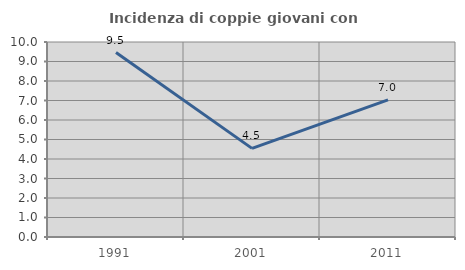
| Category | Incidenza di coppie giovani con figli |
|---|---|
| 1991.0 | 9.459 |
| 2001.0 | 4.545 |
| 2011.0 | 7.031 |